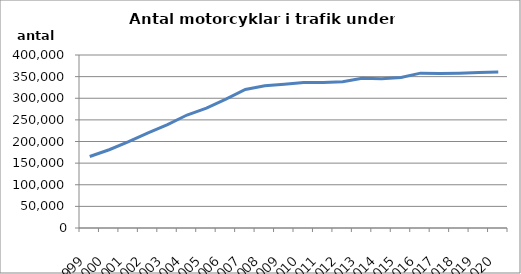
| Category | Series 0 |
|---|---|
| 1999.0 | 165310 |
| 2000.0 | 180915 |
| 2001.0 | 199451 |
| 2002.0 | 220079 |
| 2003.0 | 238981 |
| 2004.0 | 261214 |
| 2005.0 | 277039 |
| 2006.0 | 297983 |
| 2007.0 | 320392 |
| 2008.0 | 329084 |
| 2009.0 | 332561 |
| 2010.0 | 336197 |
| 2011.0 | 336439 |
| 2012.0 | 338339 |
| 2013.0 | 346314 |
| 2014.0 | 344988 |
| 2015.0 | 347906 |
| 2016.0 | 358019 |
| 2017.0 | 357231 |
| 2018.0 | 358024 |
| 2019.0 | 359380 |
| 2020.0 | 360422 |